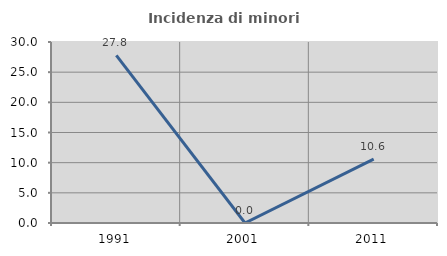
| Category | Incidenza di minori stranieri |
|---|---|
| 1991.0 | 27.778 |
| 2001.0 | 0 |
| 2011.0 | 10.588 |